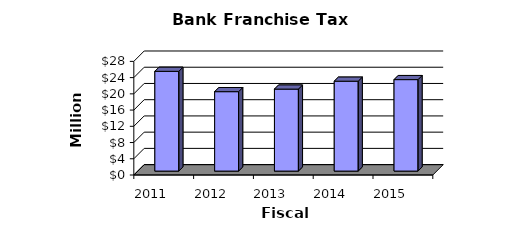
| Category | Series 0 |
|---|---|
| 2011.0 | 24580000 |
| 2012.0 | 19570000 |
| 2013.0 | 20202000 |
| 2014.0 | 22149000 |
| 2015.0 | 22539000 |